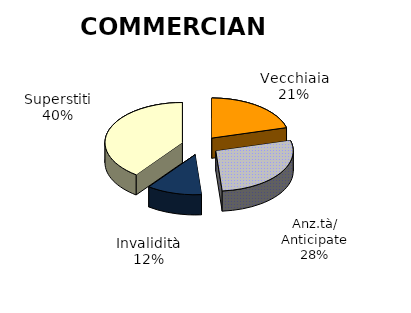
| Category | Series 0 |
|---|---|
| Vecchiaia | 8987 |
| Anz.tà/ Anticipate | 12061 |
| Invalidità | 4983 |
| Superstiti | 17201 |